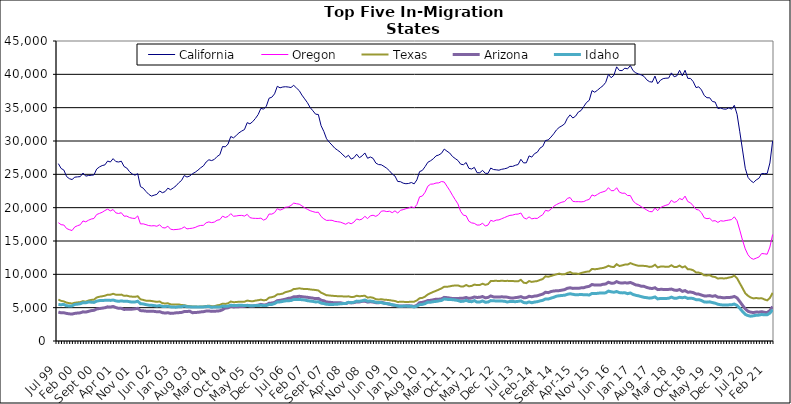
| Category | California | Oregon | Texas | Arizona | Idaho |
|---|---|---|---|---|---|
| Jul 99 | 26605 | 17749 | 6209 | 4339 | 5471 |
| Aug 99 | 25882 | 17447 | 6022 | 4228 | 5444 |
| Sep 99 | 25644 | 17401 | 5941 | 4237 | 5488 |
| Oct 99 | 24669 | 16875 | 5751 | 4134 | 5279 |
| Nov 99 | 24353 | 16701 | 5680 | 4073 | 5260 |
| Dec 99 | 24218 | 16570 | 5619 | 4042 | 5269 |
| Jan 00 | 24574 | 17109 | 5736 | 4142 | 5485 |
| Feb 00 | 24620 | 17295 | 5789 | 4192 | 5530 |
| Mar 00 | 24655 | 17436 | 5826 | 4226 | 5590 |
| Apr 00 | 25195 | 18009 | 5980 | 4375 | 5748 |
| May 00 | 24730 | 17875 | 5897 | 4337 | 5729 |
| Jun 00 | 24825 | 18113 | 6070 | 4444 | 5853 |
| Jul 00 | 24857 | 18294 | 6163 | 4555 | 5824 |
| Aug 00 | 24913 | 18376 | 6199 | 4603 | 5788 |
| Sep 00 | 25792 | 18971 | 6529 | 4804 | 5976 |
| Oct 00 | 26106 | 19135 | 6643 | 4870 | 6058 |
| Nov 00 | 26315 | 19306 | 6705 | 4926 | 6085 |
| Dec 00 | 26415 | 19570 | 6793 | 4991 | 6096 |
| Jan 01 | 26995 | 19781 | 6942 | 5122 | 6119 |
| Feb 01 | 26851 | 19519 | 6948 | 5089 | 6090 |
| Mar 01 | 27352 | 19720 | 7080 | 5180 | 6143 |
| Apr 01 | 26918 | 19221 | 6943 | 5020 | 6020 |
| May 01 | 26848 | 19126 | 6924 | 4899 | 5950 |
| Jun 01 | 26974 | 19241 | 6959 | 4895 | 6019 |
| Jul 01 | 26172 | 18725 | 6778 | 4737 | 5951 |
| Aug 01 | 25943 | 18736 | 6810 | 4757 | 5973 |
| Sep 01 | 25399 | 18514 | 6688 | 4753 | 5895 |
| Oct 01 | 25050 | 18415 | 6650 | 4780 | 5833 |
| Nov 01 | 24873 | 18381 | 6631 | 4826 | 5850 |
| Dec 01 | 25099 | 18765 | 6708 | 4898 | 5969 |
| Jan 02 | 23158 | 17561 | 6261 | 4560 | 5595 |
| Feb 02 | 22926 | 17573 | 6162 | 4531 | 5560 |
| Mar 02 | 22433 | 17452 | 6052 | 4481 | 5458 |
| Apr 02 | 22012 | 17314 | 6046 | 4458 | 5380 |
| May 02 | 21733 | 17267 | 6007 | 4452 | 5358 |
| Jun 02 | 21876 | 17298 | 5933 | 4444 | 5315 |
| Jul 02 | 21997 | 17209 | 5873 | 4383 | 5243 |
| Aug 02 | 22507 | 17436 | 5929 | 4407 | 5315 |
| Sep 02 | 22244 | 17010 | 5672 | 4248 | 5192 |
| Oct 02 | 22406 | 16952 | 5625 | 4191 | 5167 |
| Nov 02 | 22922 | 17223 | 5663 | 4242 | 5221 |
| Dec 02 | 22693 | 16770 | 5499 | 4142 | 5120 |
| Jan 03 | 22964 | 16694 | 5463 | 4166 | 5089 |
| Feb 03 | 23276 | 16727 | 5461 | 4226 | 5077 |
| Mar 03 | 23736 | 16766 | 5486 | 4251 | 5145 |
| Apr 03 | 24079 | 16859 | 5389 | 4289 | 5145 |
| May 03 | 24821 | 17117 | 5378 | 4415 | 5254 |
| Jun 03 | 24592 | 16812 | 5273 | 4426 | 5135 |
| Jul 03 | 24754 | 16875 | 5226 | 4466 | 5124 |
| Aug 03 | 25092 | 16922 | 5181 | 4244 | 5100 |
| Sep 03 | 25316 | 17036 | 5181 | 4279 | 5086 |
| Oct 03 | 25622 | 17228 | 5139 | 4301 | 5110 |
| Nov 03 | 25984 | 17335 | 5175 | 4362 | 5091 |
| Dec 03 | 26269 | 17350 | 5189 | 4396 | 5113 |
| Jan 04 | 26852 | 17734 | 5255 | 4492 | 5152 |
| Feb 04 | 27184 | 17860 | 5301 | 4502 | 5183 |
| Mar 04 | 27062 | 17757 | 5227 | 4443 | 5056 |
| Apr 04 | 27238 | 17840 | 5227 | 4461 | 5104 |
| May 04 | 27671 | 18113 | 5345 | 4493 | 5095 |
| Jun 04 | 27949 | 18201 | 5416 | 4532 | 5103 |
| Jul 04 | 29172 | 18727 | 5597 | 4697 | 5231 |
| Aug 04 | 29122 | 18529 | 5561 | 4945 | 5197 |
| Sep 04 | 29542 | 18678 | 5656 | 4976 | 5237 |
| Oct 04 | 30674 | 19108 | 5922 | 5188 | 5363 |
| Nov 04 | 30472 | 18716 | 5823 | 5106 | 5321 |
| Dec 04 | 30831 | 18755 | 5838 | 5135 | 5312 |
| Jan 05 | 31224 | 18823 | 5906 | 5155 | 5374 |
| Feb 05 | 31495 | 18842 | 5898 | 5168 | 5357 |
| Mar 05 | 31714 | 18738 | 5894 | 5212 | 5313 |
| Apr 05 | 32750 | 18998 | 6060 | 5340 | 5350 |
| May 05 | 32575 | 18504 | 5989 | 5269 | 5276 |
| Jun 05 | 32898 | 18414 | 5954 | 5252 | 5271 |
| Jul 05 | 33384 | 18395 | 6062 | 5322 | 5322 |
| Aug 05 | 33964 | 18381 | 6113 | 5375 | 5316 |
| Sep 05 | 34897 | 18426 | 6206 | 5493 | 5362 |
| Oct 05 | 34780 | 18132 | 6100 | 5408 | 5308 |
| Nov 05 | 35223 | 18332 | 6162 | 5434 | 5314 |
| Dec 05 | 36415 | 19047 | 6508 | 5658 | 5487 |
| Jan 06 | 36567 | 19032 | 6576 | 5688 | 5480 |
| Feb 06 | 37074 | 19257 | 6692 | 5792 | 5616 |
| Mar 06 | 38207 | 19845 | 6993 | 6052 | 5850 |
| Apr 06 | 37976 | 19637 | 7024 | 6101 | 5864 |
| May 06 | 38099 | 19781 | 7114 | 6178 | 5943 |
| Jun 06 | 38141 | 20061 | 7331 | 6276 | 6018 |
| Jul 06 | 38097 | 20111 | 7431 | 6399 | 6046 |
| Aug 06 | 38021 | 20333 | 7542 | 6450 | 6064 |
| Sep 06 | 38349 | 20686 | 7798 | 6627 | 6232 |
| Oct 06 | 37947 | 20591 | 7825 | 6647 | 6216 |
| Nov 06 | 37565 | 20526 | 7907 | 6707 | 6244 |
| Dec 06 | 36884 | 20272 | 7840 | 6648 | 6192 |
| Jan 07 | 36321 | 19984 | 7789 | 6597 | 6151 |
| Feb 07 | 35752 | 19752 | 7799 | 6554 | 6048 |
| Mar 07 | 35025 | 19547 | 7737 | 6487 | 5989 |
| Apr 07 | 34534 | 19412 | 7685 | 6430 | 5937 |
| May 07 | 34022 | 19296 | 7654 | 6353 | 5858 |
| Jun 07 | 33974 | 19318 | 7577 | 6390 | 5886 |
| Jul 07 | 32298 | 18677 | 7250 | 6117 | 5682 |
| Aug 07 | 31436 | 18322 | 7070 | 6034 | 5617 |
| Sep 07 | 30331 | 18087 | 6853 | 5847 | 5500 |
| Oct 07 | 29813 | 18108 | 6839 | 5821 | 5489 |
| Nov 07 | 29384 | 18105 | 6777 | 5769 | 5481 |
| Dec 07 | 28923 | 17949 | 6760 | 5733 | 5499 |
| Jan 08 | 28627 | 17890 | 6721 | 5732 | 5521 |
| Feb 08 | 28328 | 17834 | 6719 | 5749 | 5579 |
| Mar 08 | 27911 | 17680 | 6690 | 5650 | 5614 |
| Apr 08 | 27543 | 17512 | 6656 | 5612 | 5635 |
| May 08 | 27856 | 17754 | 6705 | 5774 | 5798 |
| Jun 08 | 27287 | 17589 | 6593 | 5717 | 5745 |
| Jul 08 | 27495 | 17834 | 6623 | 5761 | 5807 |
| Aug 08 | 28018 | 18309 | 6789 | 5867 | 5982 |
| Sep-08 | 27491 | 18164 | 6708 | 5864 | 5954 |
| Oct 08 | 27771 | 18291 | 6755 | 5942 | 6032 |
| Nov 08 | 28206 | 18706 | 6787 | 5970 | 6150 |
| Dec 08 | 27408 | 18353 | 6505 | 5832 | 5975 |
| Jan 09 | 27601 | 18778 | 6569 | 5890 | 5995 |
| Feb 09 | 27394 | 18863 | 6483 | 5845 | 5936 |
| Mar 09 | 26690 | 18694 | 6273 | 5751 | 5806 |
| Apr 09 | 26461 | 18943 | 6222 | 5735 | 5777 |
| May 09 | 26435 | 19470 | 6272 | 5819 | 5767 |
| Jun 09 | 26187 | 19522 | 6199 | 5700 | 5649 |
| Jul 09 | 25906 | 19408 | 6171 | 5603 | 5617 |
| Aug 09 | 25525 | 19469 | 6128 | 5533 | 5540 |
| Sep 09 | 25050 | 19249 | 6059 | 5405 | 5437 |
| Oct 09 | 24741 | 19529 | 6004 | 5349 | 5369 |
| Nov 09 | 23928 | 19187 | 5854 | 5271 | 5248 |
| Dec 09 | 23899 | 19607 | 5886 | 5261 | 5195 |
| Jan 10 | 23676 | 19703 | 5881 | 5232 | 5234 |
| Feb 10 | 23592 | 19845 | 5850 | 5272 | 5236 |
| Mar 10 | 23634 | 19946 | 5864 | 5278 | 5219 |
| Apr 10 | 23774 | 20134 | 5889 | 5257 | 5201 |
| May 10 | 23567 | 19966 | 5897 | 5172 | 5105 |
| Jun 10 | 24166 | 20464 | 6087 | 5356 | 5237 |
| Jul 10 | 25410 | 21627 | 6417 | 5742 | 5452 |
| Aug 10 | 25586 | 21744 | 6465 | 5797 | 5491 |
| Sep 10 | 26150 | 22314 | 6667 | 5907 | 5609 |
| Oct 10 | 26807 | 23219 | 6986 | 6070 | 5831 |
| Nov 10 | 27033 | 23520 | 7179 | 6100 | 5810 |
| Dec 10 | 27332 | 23551 | 7361 | 6182 | 5898 |
| Jan 11 | 27769 | 23697 | 7525 | 6276 | 5938 |
| Feb 11 | 27898 | 23718 | 7708 | 6267 | 6016 |
| Mar 11 | 28155 | 23921 | 7890 | 6330 | 6081 |
| Apr 11 | 28790 | 23847 | 8146 | 6544 | 6305 |
| May 11 | 28471 | 23215 | 8131 | 6502 | 6248 |
| Jun 11 | 28191 | 22580 | 8199 | 6445 | 6217 |
| Jul 11 | 27678 | 21867 | 8291 | 6368 | 6202 |
| Aug 11 | 27372 | 21203 | 8321 | 6356 | 6146 |
| Sep 11 | 27082 | 20570 | 8341 | 6387 | 6075 |
| Oct 11 | 26528 | 19442 | 8191 | 6402 | 5932 |
| Nov 11 | 26440 | 18872 | 8176 | 6426 | 5968 |
| Dec 11 | 26770 | 18784 | 8401 | 6533 | 6106 |
| Jan 12 | 25901 | 17963 | 8202 | 6390 | 5933 |
| Feb 12 | 25796 | 17718 | 8266 | 6456 | 5900 |
| Mar 12 | 26042 | 17647 | 8456 | 6600 | 6054 |
| Apr 12 | 25239 | 17386 | 8388 | 6534 | 5838 |
| May 12 | 25238 | 17407 | 8401 | 6558 | 5854 |
| Jun 12 | 25593 | 17673 | 8594 | 6669 | 6009 |
| Jul 12 | 25155 | 17237 | 8432 | 6474 | 5817 |
| Aug 12 | 25146 | 17391 | 8536 | 6539 | 5842 |
| Sep 12 | 25942 | 18102 | 8989 | 6759 | 6061 |
| Oct 12 | 25718 | 17953 | 9012 | 6618 | 6027 |
| Nov 12 | 25677 | 18134 | 9032 | 6611 | 6009 |
| Dec 12 | 25619 | 18166 | 8981 | 6601 | 5999 |
| Jan 13 | 25757 | 18344 | 9051 | 6627 | 5989 |
| Feb-13 | 25830 | 18512 | 9001 | 6606 | 5968 |
| Mar-13 | 25940 | 18689 | 9021 | 6577 | 5853 |
| Apr 13 | 26187 | 18844 | 9013 | 6478 | 5925 |
| May 13 | 26192 | 18884 | 9003 | 6431 | 5924 |
| Jun-13 | 26362 | 19013 | 8948 | 6508 | 5896 |
| Jul 13 | 26467 | 19037 | 8958 | 6559 | 5948 |
| Aug 13 | 27253 | 19198 | 9174 | 6655 | 6020 |
| Sep 13 | 26711 | 18501 | 8747 | 6489 | 5775 |
| Oct 13 | 26733 | 18301 | 8681 | 6511 | 5711 |
| Nov 13 | 27767 | 18620 | 8989 | 6709 | 5860 |
| Dec 13 | 27583 | 18320 | 8863 | 6637 | 5740 |
| Jan 14 | 28107 | 18409 | 8939 | 6735 | 5843 |
| Feb-14 | 28313 | 18383 | 8989 | 6779 | 5893 |
| Mar 14 | 28934 | 18696 | 9160 | 6918 | 6015 |
| Apr 14 | 29192 | 18946 | 9291 | 7036 | 6099 |
| May 14 | 30069 | 19603 | 9701 | 7314 | 6304 |
| Jun 14 | 30163 | 19487 | 9641 | 7252 | 6293 |
| Jul-14 | 30587 | 19754 | 9752 | 7415 | 6427 |
| Aug-14 | 31074 | 20201 | 9882 | 7499 | 6557 |
| Sep 14 | 31656 | 20459 | 9997 | 7536 | 6719 |
| Oct 14 | 32037 | 20663 | 10109 | 7555 | 6786 |
| Nov 14 | 32278 | 20825 | 9992 | 7628 | 6831 |
| Dec 14 | 32578 | 20918 | 10006 | 7705 | 6860 |
| Jan 15 | 33414 | 21396 | 10213 | 7906 | 7000 |
| Feb 15 | 33922 | 21518 | 10337 | 7982 | 7083 |
| Mar 15 | 33447 | 20942 | 10122 | 7891 | 7006 |
| Apr-15 | 33731 | 20893 | 10138 | 7906 | 6931 |
| May 15 | 34343 | 20902 | 10053 | 7895 | 6952 |
| Jun-15 | 34572 | 20870 | 10192 | 7973 | 6966 |
| Jul 15 | 35185 | 20916 | 10303 | 8000 | 6949 |
| Aug 15 | 35780 | 21115 | 10399 | 8126 | 6938 |
| Sep 15 | 36109 | 21246 | 10428 | 8207 | 6896 |
| Oct 15 | 37555 | 21908 | 10813 | 8477 | 7140 |
| Nov 15 | 37319 | 21750 | 10763 | 8390 | 7112 |
| Dec 15 | 37624 | 21990 | 10807 | 8395 | 7149 |
| Jan 16 | 37978 | 22248 | 10892 | 8388 | 7201 |
| Feb 16 | 38285 | 22369 | 10951 | 8508 | 7192 |
| Mar 16 | 38792 | 22506 | 11075 | 8547 | 7226 |
| Apr 16 | 39994 | 22999 | 11286 | 8815 | 7487 |
| May 16 | 39488 | 22548 | 11132 | 8673 | 7382 |
| Jun 16 | 39864 | 22556 | 11100 | 8682 | 7315 |
| Jul 16 | 41123 | 22989 | 11516 | 8903 | 7420 |
| Aug 16 | 40573 | 22333 | 11251 | 8731 | 7261 |
| Sep 16 | 40560 | 22162 | 11340 | 8692 | 7216 |
| Oct 16 | 40923 | 22172 | 11456 | 8742 | 7233 |
| Nov 16 | 40817 | 21818 | 11459 | 8685 | 7101 |
| Dec 16 | 41311 | 21815 | 11681 | 8783 | 7203 |
| Jan 17 | 40543 | 21029 | 11524 | 8609 | 6982 |
| Feb 17 | 40218 | 20613 | 11385 | 8416 | 6852 |
| Mar 17 | 40052 | 20425 | 11276 | 8354 | 6775 |
| Apr 17 | 39913 | 20147 | 11297 | 8218 | 6653 |
| May 17 | 39695 | 19910 | 11265 | 8196 | 6552 |
| Jun 17 | 39177 | 19650 | 11225 | 8034 | 6500 |
| Jul 17 | 38901 | 19419 | 11115 | 7923 | 6429 |
| Aug 17 | 38827 | 19389 | 11168 | 7867 | 6479 |
| Sep 17 | 39736 | 19936 | 11426 | 7991 | 6609 |
| Oct 17 | 38576 | 19547 | 11041 | 7708 | 6315 |
| Nov 17 | 39108 | 20013 | 11158 | 7746 | 6381 |
| Dec 17 | 39359 | 20202 | 11185 | 7743 | 6366 |
| Jan 18 | 39420 | 20362 | 11118 | 7736 | 6380 |
| Feb 18 | 39440 | 20476 | 11128 | 7741 | 6407 |
| Mar 18 | 40218 | 21106 | 11362 | 7789 | 6578 |
| Apr 18 | 39637 | 20788 | 11111 | 7642 | 6423 |
| May 18 | 39777 | 20933 | 11097 | 7591 | 6430 |
| Jun 18 | 40602 | 21381 | 11317 | 7721 | 6554 |
| Jul 18 | 39767 | 21189 | 11038 | 7445 | 6489 |
| Aug 18 | 40608 | 21729 | 11200 | 7560 | 6569 |
| Sep 18 | 39395 | 20916 | 10772 | 7318 | 6383 |
| Oct 18 | 39383 | 20724 | 10740 | 7344 | 6429 |
| Nov 18 | 38891 | 20265 | 10605 | 7255 | 6365 |
| Dec 18 | 38013 | 19741 | 10292 | 7069 | 6205 |
| Jan 19 | 38130 | 19643 | 10261 | 7032 | 6203 |
| Feb 19 | 37658 | 19237 | 10132 | 6892 | 6073 |
| Mar 19 | 36831 | 18492 | 9848 | 6766 | 5863 |
| Apr 19 | 36492 | 18349 | 9839 | 6763 | 5827 |
| May 19 | 36481 | 18407 | 9867 | 6809 | 5873 |
| Jun 19 | 35925 | 17998 | 9661 | 6698 | 5761 |
| Jul 19 | 35843 | 18049 | 9598 | 6800 | 5673 |
| Aug 19 | 34870 | 17785 | 9361 | 6577 | 5512 |
| Sep 19 | 34945 | 18038 | 9428 | 6547 | 5437 |
| Oct 19 | 34802 | 17977 | 9385 | 6483 | 5390 |
| Nov 19 | 34775 | 18072 | 9403 | 6511 | 5401 |
| Dec 19 | 34976 | 18140 | 9518 | 6521 | 5419 |
| Jan 20 | 34774 | 18209 | 9594 | 6561 | 5434 |
| Feb 20 | 35352 | 18632 | 9804 | 6682 | 5543 |
| Mar 20 | 34013 | 18041 | 9411 | 6464 | 5330 |
| Apr 20 | 31385 | 16629 | 8666 | 5922 | 4906 |
| May 20 | 28657 | 15123 | 7927 | 5355 | 4419 |
| Jun 20 | 25915 | 13817 | 7164 | 4815 | 3992 |
| Jul 20 | 24545 | 12926 | 6776 | 4457 | 3810 |
| Aug 20 | 24048 | 12443 | 6521 | 4326 | 3720 |
| Sep 20 | 23756 | 12258 | 6386 | 4266 | 3784 |
| Oct 20 | 24166 | 12429 | 6452 | 4347 | 3861 |
| Nov 20 | 24404 | 12597 | 6386 | 4324 | 3883 |
| Dec 20 | 25120 | 13122 | 6420 | 4394 | 3974 |
| Jan 21 | 25111 | 13080 | 6236 | 4304 | 3924 |
| Feb 21 | 25114 | 13015 | 6094 | 4260 | 3930 |
| Mar 21 | 26701 | 14096 | 6455 | 4567 | 4185 |
| Apr 21 | 29998 | 15978 | 7222 | 5164 | 4697 |